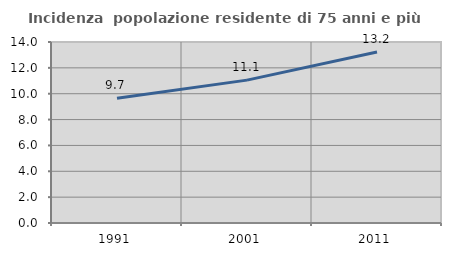
| Category | Incidenza  popolazione residente di 75 anni e più |
|---|---|
| 1991.0 | 9.651 |
| 2001.0 | 11.052 |
| 2011.0 | 13.23 |